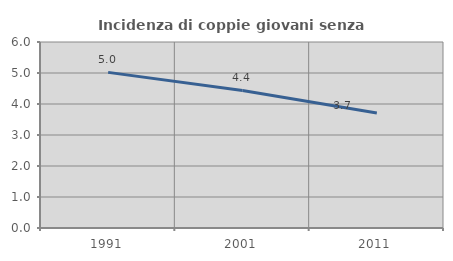
| Category | Incidenza di coppie giovani senza figli |
|---|---|
| 1991.0 | 5.02 |
| 2001.0 | 4.437 |
| 2011.0 | 3.711 |